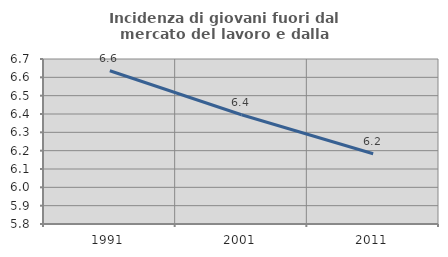
| Category | Incidenza di giovani fuori dal mercato del lavoro e dalla formazione  |
|---|---|
| 1991.0 | 6.636 |
| 2001.0 | 6.396 |
| 2011.0 | 6.183 |